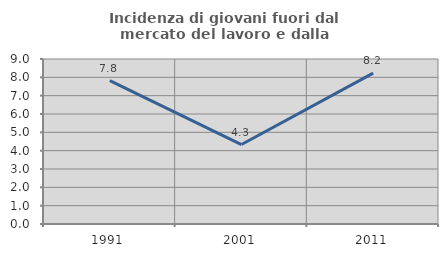
| Category | Incidenza di giovani fuori dal mercato del lavoro e dalla formazione  |
|---|---|
| 1991.0 | 7.818 |
| 2001.0 | 4.333 |
| 2011.0 | 8.227 |